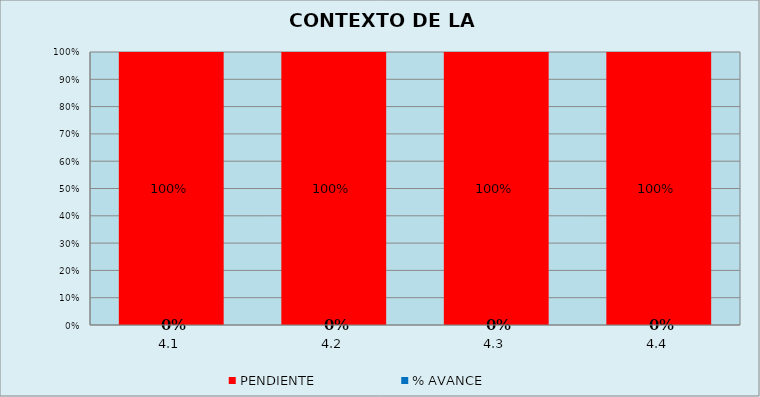
| Category | % AVANCE | PENDIENTE |
|---|---|---|
| 4.1 | 0 | 1 |
| 4.2 | 0 | 1 |
| 4.3 | 0 | 1 |
| 4.4 | 0 | 1 |